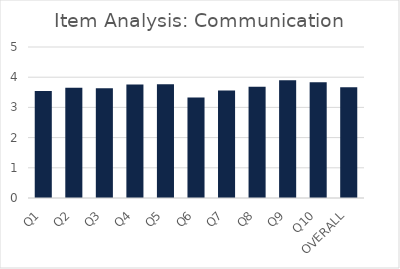
| Category | Series 0 |
|---|---|
| Q1 | 3.54 |
| Q2 | 3.65 |
| Q3 | 3.63 |
| Q4 | 3.76 |
| Q5 | 3.77 |
| Q6 | 3.33 |
| Q7 | 3.56 |
| Q8 | 3.68 |
| Q9 | 3.9 |
| Q10 | 3.83 |
| OVERALL | 3.67 |